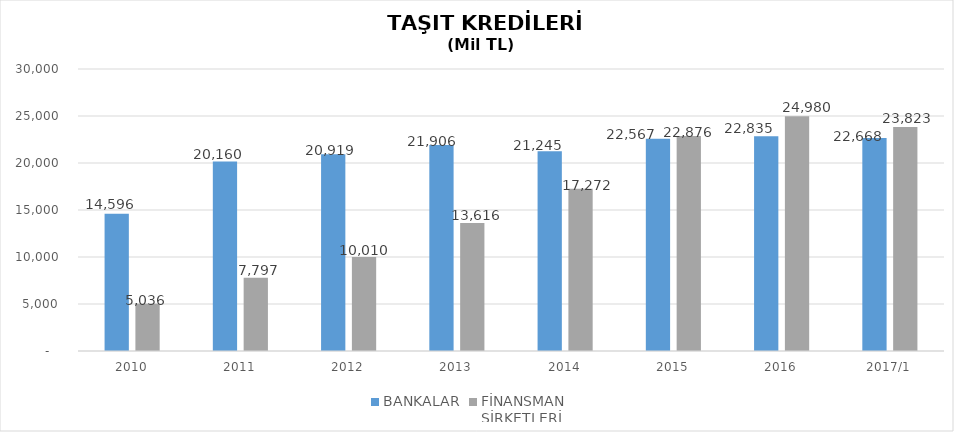
| Category | BANKALAR | FİNANSMAN 
ŞİRKETLERİ |
|---|---|---|
| 2010 | 14596 | 5035.89 |
| 2011 | 20160 | 7796.854 |
| 2012 | 20919 | 10009.755 |
| 2013 | 21906 | 13616.036 |
| 2014 | 21245 | 17271.844 |
| 2015 | 22567 | 22875.563 |
| 2016 | 22835 | 24980.231 |
| 2017/1 | 22668 | 23823.461 |